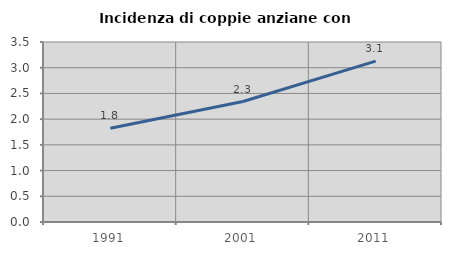
| Category | Incidenza di coppie anziane con figli |
|---|---|
| 1991.0 | 1.823 |
| 2001.0 | 2.342 |
| 2011.0 | 3.127 |